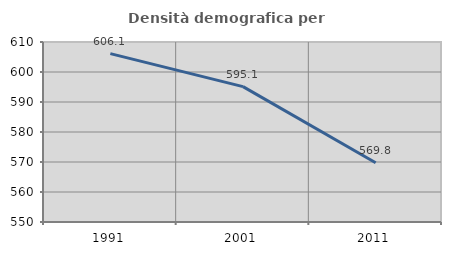
| Category | Densità demografica |
|---|---|
| 1991.0 | 606.131 |
| 2001.0 | 595.138 |
| 2011.0 | 569.765 |